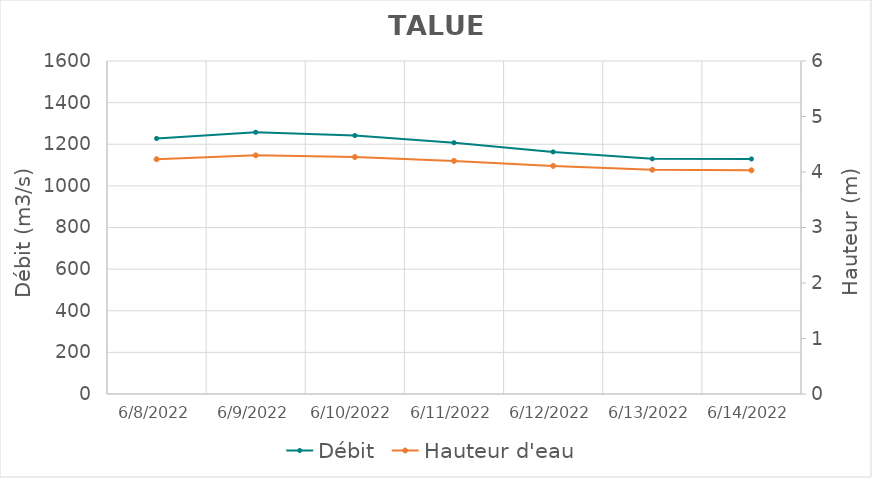
| Category | Débit |
|---|---|
| 4/26/22 | 1550.77 |
| 4/25/22 | 1513.85 |
| 4/24/22 | 1449.65 |
| 4/23/22 | 1390 |
| 4/22/22 | 1337.8 |
| 4/21/22 | 1255.85 |
| 4/20/22 | 1234.26 |